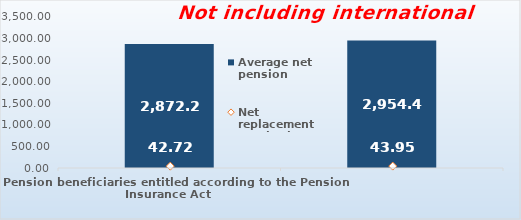
| Category | Average net pension  |
|---|---|
| Pension beneficiaries entitled according to the Pension Insurance Act   | 2872.27 |
| Pension beneficiaries entitled to pension FOR THE FIRST TIME in 2020 according to the Pension Insurance Act  - NEW BENEFICIARIES | 2954.493 |